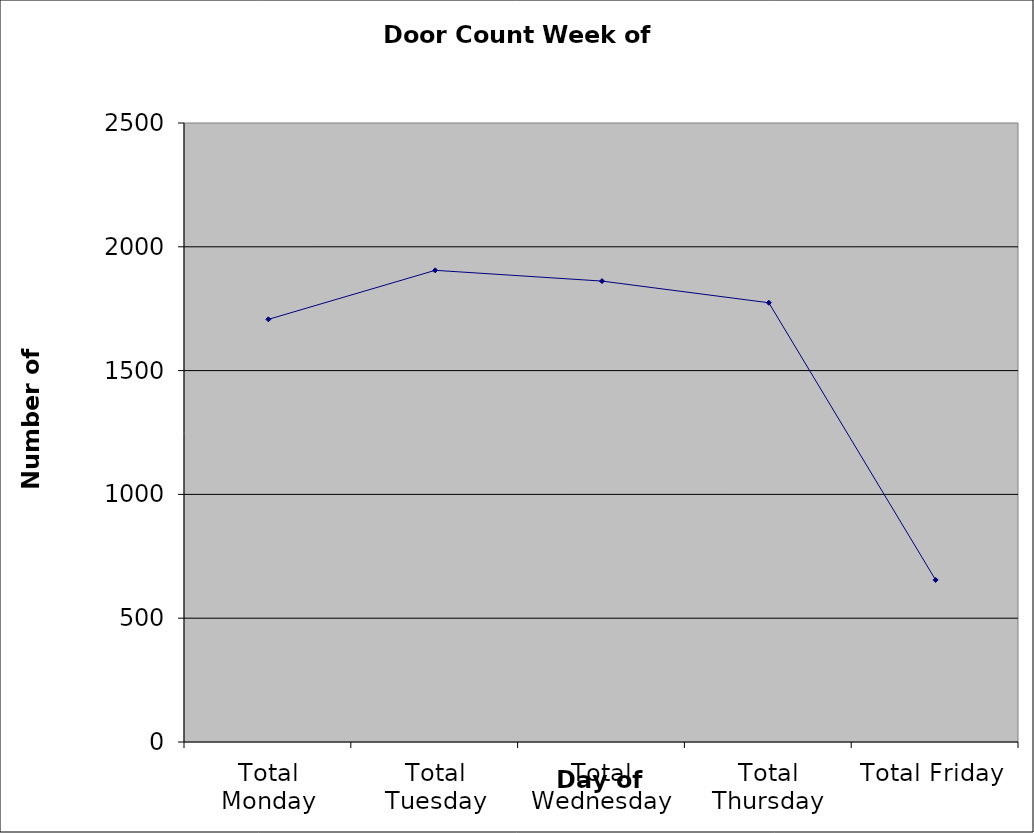
| Category | Series 0 |
|---|---|
| Total Monday | 1707 |
| Total Tuesday | 1905 |
| Total Wednesday | 1861.5 |
| Total Thursday | 1774 |
| Total Friday | 654.5 |